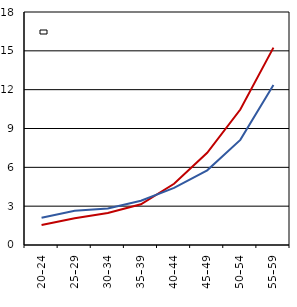
| Category | (%) ženy 
(%) Women | (%) muži 
(%)  Men |
|---|---|---|
| 20–24 | 1.552 | 2.104 |
| 25–29 | 2.066 | 2.645 |
| 30–34 | 2.478 | 2.823 |
| 35–39 | 3.146 | 3.415 |
| 40–44 | 4.728 | 4.418 |
| 45–49 | 7.125 | 5.766 |
| 50–54 | 10.466 | 8.121 |
| 55–59 | 15.249 | 12.363 |